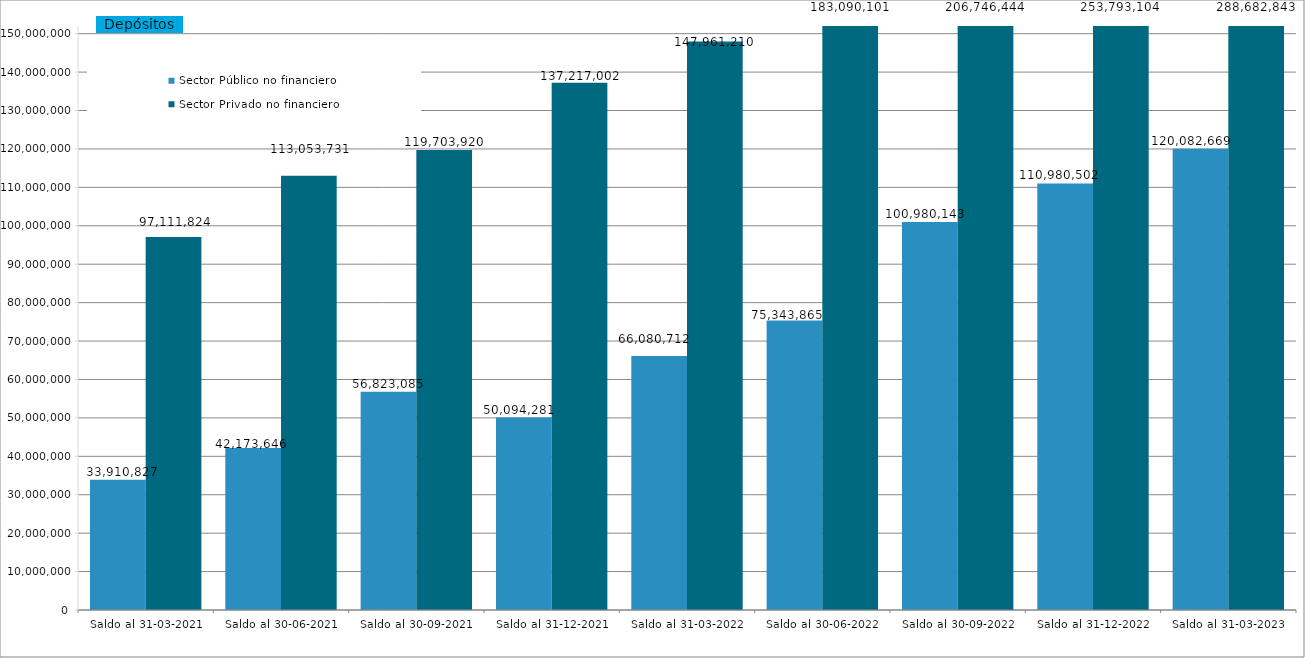
| Category | Sector Público no financiero | Sector Privado no financiero |
|---|---|---|
| Saldo al 31-03-2021 | 33910826.556 | 97111824.239 |
| Saldo al 30-06-2021 | 42173646.22 | 113053731.035 |
| Saldo al 30-09-2021 | 56823084.514 | 119703920.326 |
| Saldo al 31-12-2021 | 50094280.76 | 137217001.819 |
| Saldo al 31-03-2022 | 66080711.607 | 147961209.904 |
| Saldo al 30-06-2022 | 75343864.844 | 183090100.913 |
| Saldo al 30-09-2022 | 100980143.371 | 206746444.315 |
| Saldo al 31-12-2022 | 110980501.9 | 253793103.969 |
| Saldo al 31-03-2023 | 120082669.051 | 288682842.63 |